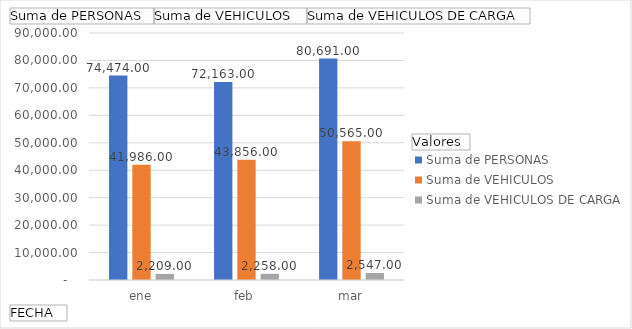
| Category | Suma de PERSONAS | Suma de VEHICULOS  | Suma de VEHICULOS DE CARGA |
|---|---|---|---|
| ene | 74474 | 41986 | 2209 |
| feb | 72163 | 43856 | 2258 |
| mar | 80691 | 50565 | 2547 |